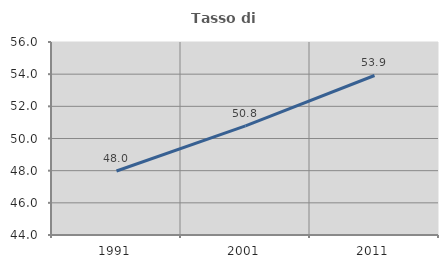
| Category | Tasso di occupazione   |
|---|---|
| 1991.0 | 47.981 |
| 2001.0 | 50.785 |
| 2011.0 | 53.918 |